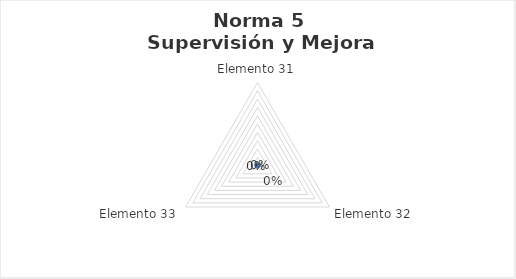
| Category | Series 0 |
|---|---|
| Elemento 31 | 0 |
| Elemento 32 | 0 |
| Elemento 33 | 0 |